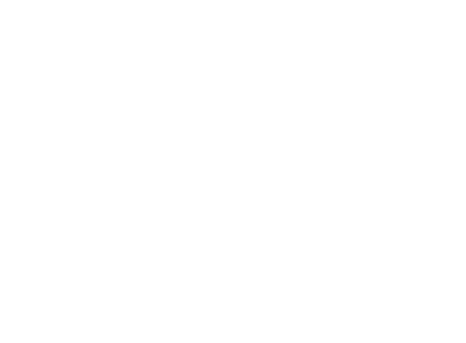
| Category | Near native & fragments |
|---|---|
| No invasive species | 0.016 |
| Invasive species ≤ 10% cover BUT NO Rhodo/Laurel present | 0 |
| Invasive species > 10% cover BUT NO Rhodo/Laurel present | 0 |
| Invasive species ≤ 10% cover AND Rhodo/Laurel present | 0.002 |
| Invasive species > 10% cover AND Rhodo/Laurel present | 0.001 |